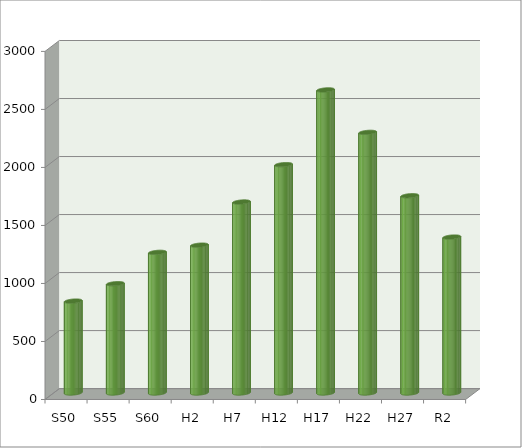
| Category | Series 0 |
|---|---|
| S50 | 792 |
| S55 | 942 |
| S60 | 1212 |
| H2 | 1274 |
| H7 | 1646 |
| H12 | 1968 |
| H17 | 2612 |
| H22 | 2246 |
| H27 | 1700 |
| R2 | 1344 |